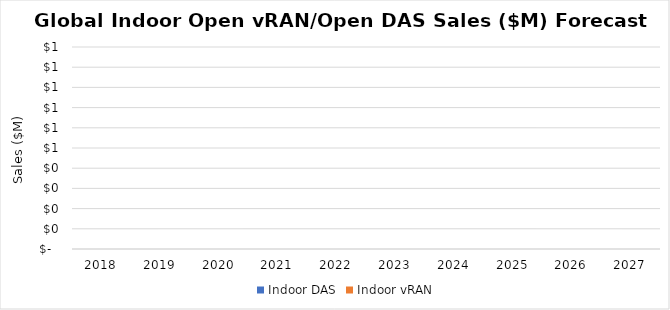
| Category | Indoor DAS | Indoor vRAN |
|---|---|---|
| 2018.0 | 0 | 0 |
| 2019.0 | 0 | 0 |
| 2020.0 | 0 | 0 |
| 2021.0 | 0 | 0 |
| 2022.0 | 0 | 0 |
| 2023.0 | 0 | 0 |
| 2024.0 | 0 | 0 |
| 2025.0 | 0 | 0 |
| 2026.0 | 0 | 0 |
| 2027.0 | 0 | 0 |